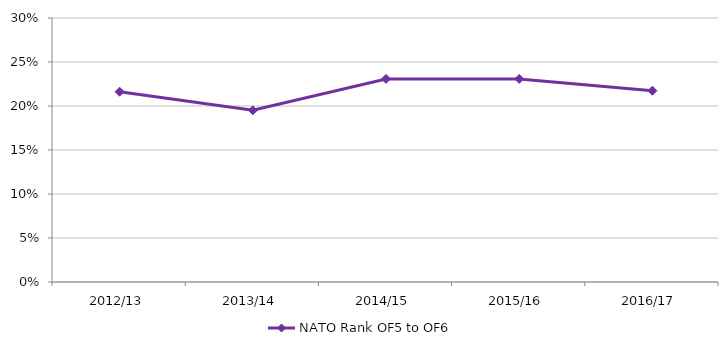
| Category | NATO Rank OF5 to OF6 |
|---|---|
| 2012/13 | 0.216 |
| 2013/14 | 0.195 |
| 2014/15 | 0.231 |
| 2015/16 | 0.231 |
| 2016/17 | 0.217 |